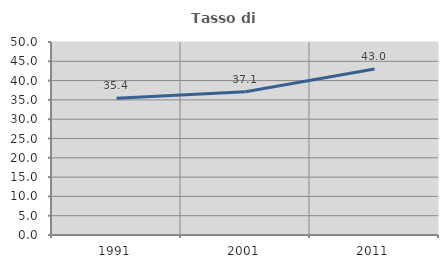
| Category | Tasso di occupazione   |
|---|---|
| 1991.0 | 35.418 |
| 2001.0 | 37.132 |
| 2011.0 | 43.021 |